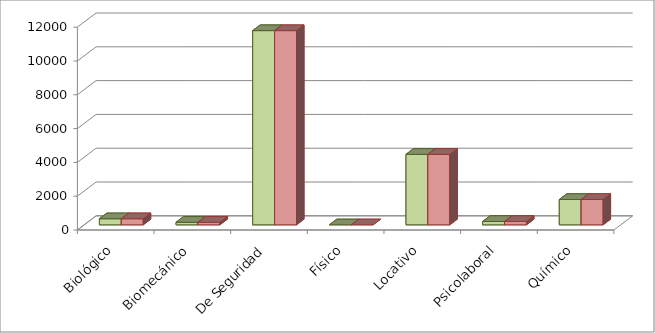
| Category | Series 0 | Series 1 |
|---|---|---|
| Biológico | 360 | 360 |
| Biomecánico | 150 | 150 |
| De Seguridad | 11490 | 11490 |
| Físico | 0 | 0 |
| Locativo | 4170 | 4170 |
| Psicolaboral | 200 | 200 |
| Químico | 1500 | 1500 |